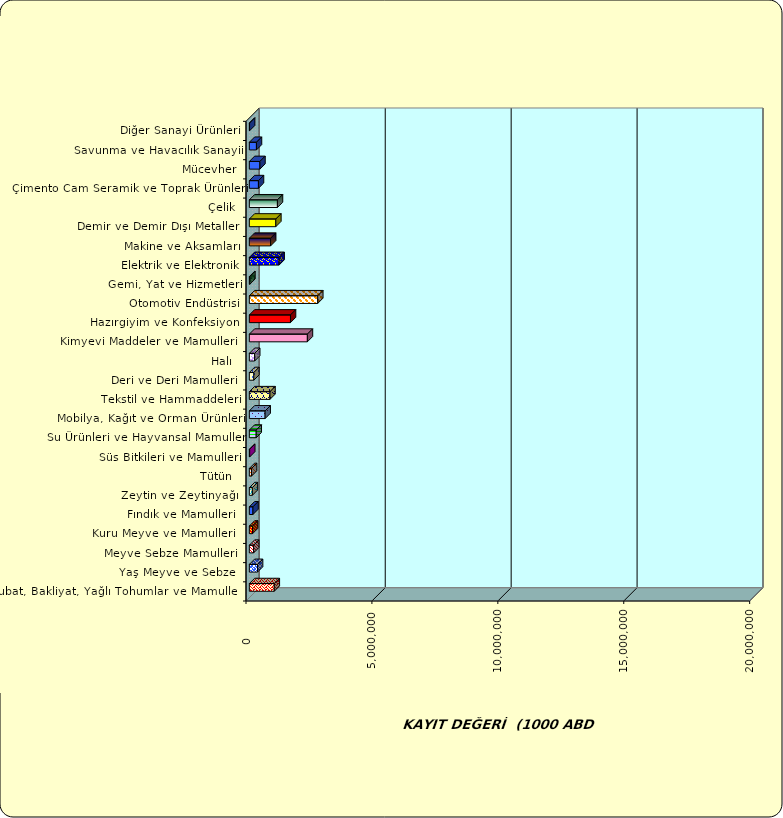
| Category | Series 0 |
|---|---|
|  Hububat, Bakliyat, Yağlı Tohumlar ve Mamulleri  | 989464.667 |
|  Yaş Meyve ve Sebze   | 325100.643 |
|  Meyve Sebze Mamulleri  | 170739.854 |
|  Kuru Meyve ve Mamulleri   | 128117.142 |
|  Fındık ve Mamulleri  | 143380.07 |
|  Zeytin ve Zeytinyağı  | 119781.418 |
|  Tütün  | 86086.11 |
|  Süs Bitkileri ve Mamulleri | 13964.295 |
|  Su Ürünleri ve Hayvansal Mamuller | 272220.711 |
|  Mobilya, Kağıt ve Orman Ürünleri | 626715.738 |
|  Tekstil ve Hammaddeleri | 818844.41 |
|  Deri ve Deri Mamulleri  | 178765.281 |
|  Halı  | 211588.227 |
|  Kimyevi Maddeler ve Mamulleri   | 2304656.614 |
|  Hazırgiyim ve Konfeksiyon  | 1633774.484 |
|  Otomotiv Endüstrisi | 2715993.143 |
|  Gemi, Yat ve Hizmetleri | 20520.98 |
|  Elektrik ve Elektronik | 1181220.011 |
|  Makine ve Aksamları | 845229.704 |
|  Demir ve Demir Dışı Metaller  | 1051191.264 |
|  Çelik | 1115232.231 |
|  Çimento Cam Seramik ve Toprak Ürünleri | 361385.004 |
|  Mücevher | 419909.456 |
|  Savunma ve Havacılık Sanayii | 281475.748 |
|  Diğer Sanayi Ürünleri | 9110.848 |